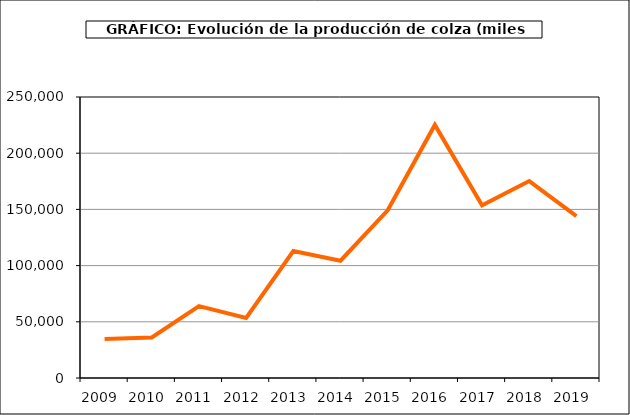
| Category | Producción |
|---|---|
| 2009.0 | 34663 |
| 2010.0 | 36029 |
| 2011.0 | 63902 |
| 2012.0 | 53447 |
| 2013.0 | 112928 |
| 2014.0 | 104361 |
| 2015.0 | 149198 |
| 2016.0 | 225165 |
| 2017.0 | 153665 |
| 2018.0 | 175231 |
| 2019.0 | 143981 |